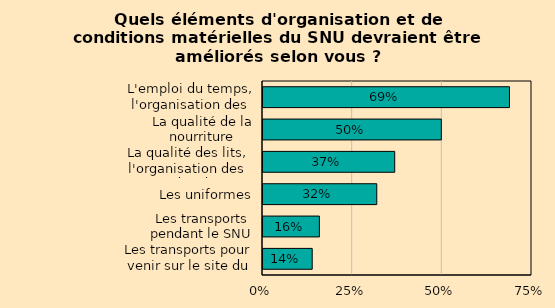
| Category | Series 0 |
|---|---|
| L'emploi du temps, l'organisation des journées | 0.69 |
| La qualité de la nourriture | 0.5 |
| La qualité des lits, l'organisation des nuits et des dortoirs | 0.37 |
| Les uniformes | 0.32 |
| Les transports pendant le SNU | 0.16 |
| Les transports pour venir sur le site du SNU | 0.14 |